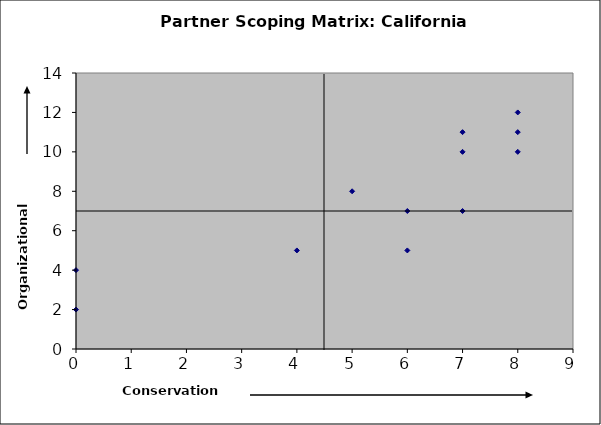
| Category | NGO 1 Agcy 1 Agcy 2 Agcy 3 Agcy 4 NGO 2 Agcy 7 NGO 5 NGO 6 Agcy 5 Agcy 6 NGO 3 |
|---|---|
| 8.0 | 11 |
| 8.0 | 12 |
| 7.0 | 10 |
| 8.0 | 10 |
| 7.0 | 11 |
| 6.0 | 7 |
| 6.0 | 5 |
| 0.0 | 4 |
| 0.0 | 2 |
| 7.0 | 7 |
| 5.0 | 8 |
| 4.0 | 5 |